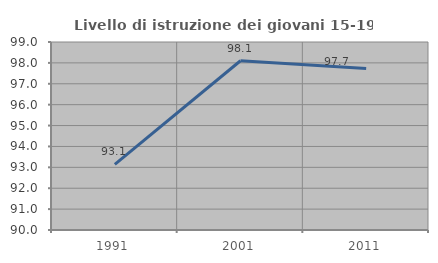
| Category | Livello di istruzione dei giovani 15-19 anni |
|---|---|
| 1991.0 | 93.139 |
| 2001.0 | 98.101 |
| 2011.0 | 97.727 |